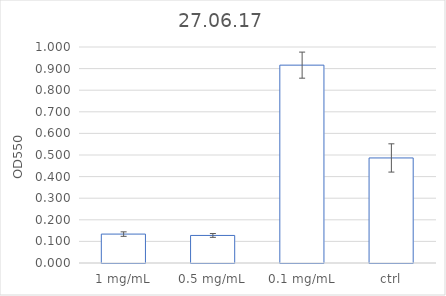
| Category | Series 0 |
|---|---|
| 1 mg/mL | 0.134 |
| 0.5 mg/mL | 0.128 |
| 0.1 mg/mL | 0.916 |
| ctrl | 0.486 |